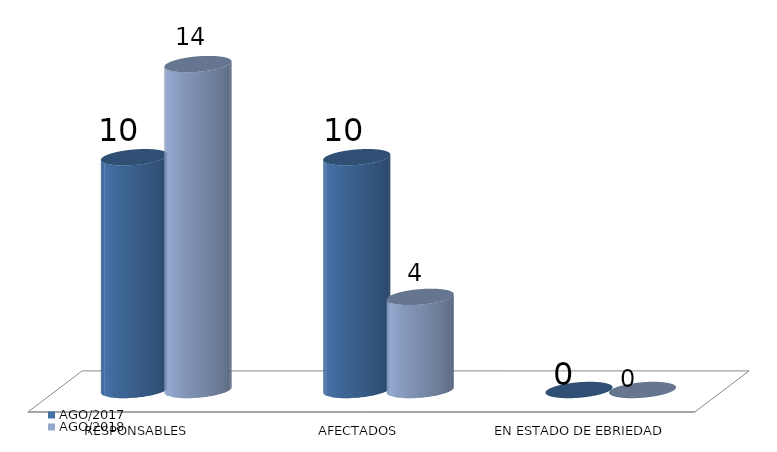
| Category | AGO/2017 | AGO/2018 |
|---|---|---|
| RESPONSABLES | 10 | 14 |
| AFECTADOS | 10 | 4 |
| EN ESTADO DE EBRIEDAD | 0 | 0 |